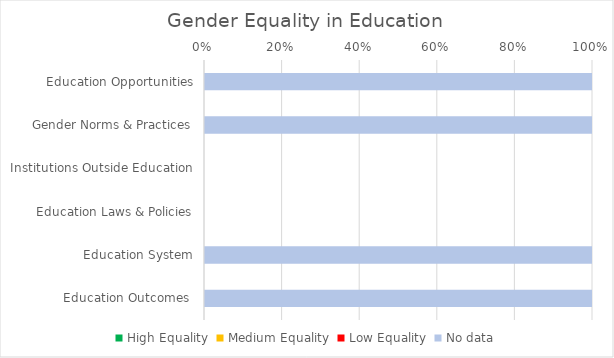
| Category | High Equality | Medium Equality | Low Equality | No data |
|---|---|---|---|---|
| Education Opportunities | 0 | 0 | 0 | 11 |
| Gender Norms & Practices | 0 | 0 | 0 | 4 |
| Institutions Outside Education | 0 | 0 | 0 | 0 |
| Education Laws & Policies | 0 | 0 | 0 | 0 |
| Education System | 0 | 0 | 0 | 4 |
| Education Outcomes  | 0 | 0 | 0 | 3 |